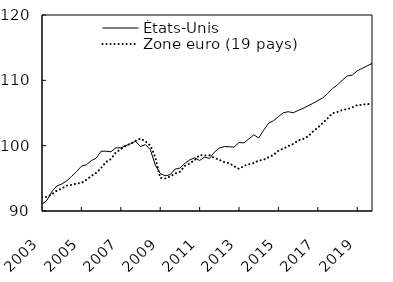
| Category | États-Unis | Zone euro (19 pays) |
|---|---|---|
| 2003-01-01 | 91.046 | 92.161 |
| 2003-04-01 | 91.627 | 92.141 |
| 2003-07-01 | 92.974 | 92.54 |
| 2003-10-01 | 93.827 | 93.105 |
| 2004-01-01 | 94.112 | 93.448 |
| 2004-04-01 | 94.613 | 93.874 |
| 2004-07-01 | 95.288 | 93.984 |
| 2004-10-01 | 96.018 | 94.198 |
| 2005-01-01 | 96.853 | 94.289 |
| 2005-04-01 | 97.074 | 94.759 |
| 2005-07-01 | 97.708 | 95.346 |
| 2005-10-01 | 98.089 | 95.832 |
| 2006-01-01 | 99.155 | 96.573 |
| 2006-04-01 | 99.152 | 97.504 |
| 2006-07-01 | 99.068 | 97.945 |
| 2006-10-01 | 99.671 | 98.972 |
| 2007-01-01 | 99.665 | 99.441 |
| 2007-04-01 | 100 | 100 |
| 2007-07-01 | 100.306 | 100.309 |
| 2007-10-01 | 100.678 | 100.751 |
| 2008-01-01 | 99.868 | 101.093 |
| 2008-04-01 | 100.158 | 100.645 |
| 2008-07-01 | 99.396 | 100.014 |
| 2008-10-01 | 97.032 | 98.231 |
| 2009-01-01 | 95.735 | 95.068 |
| 2009-04-01 | 95.396 | 94.99 |
| 2009-07-01 | 95.544 | 95.285 |
| 2009-10-01 | 96.395 | 95.72 |
| 2010-01-01 | 96.574 | 96.011 |
| 2010-04-01 | 97.284 | 96.902 |
| 2010-07-01 | 97.824 | 97.276 |
| 2010-10-01 | 98.138 | 97.812 |
| 2011-01-01 | 97.728 | 98.565 |
| 2011-04-01 | 98.254 | 98.506 |
| 2011-07-01 | 98.051 | 98.534 |
| 2011-10-01 | 99.011 | 98.118 |
| 2012-01-01 | 99.61 | 97.841 |
| 2012-04-01 | 99.867 | 97.467 |
| 2012-07-01 | 99.833 | 97.324 |
| 2012-10-01 | 99.775 | 96.865 |
| 2013-01-01 | 100.483 | 96.445 |
| 2013-04-01 | 100.431 | 96.906 |
| 2013-07-01 | 101.036 | 97.157 |
| 2013-10-01 | 101.655 | 97.332 |
| 2014-01-01 | 101.182 | 97.727 |
| 2014-04-01 | 102.368 | 97.846 |
| 2014-07-01 | 103.432 | 98.238 |
| 2014-10-01 | 103.825 | 98.582 |
| 2015-01-01 | 104.45 | 99.225 |
| 2015-04-01 | 105.037 | 99.546 |
| 2015-07-01 | 105.195 | 99.921 |
| 2015-10-01 | 105.041 | 100.27 |
| 2016-01-01 | 105.386 | 100.802 |
| 2016-04-01 | 105.706 | 101.018 |
| 2016-07-01 | 106.107 | 101.419 |
| 2016-10-01 | 106.47 | 102.151 |
| 2017-01-01 | 106.906 | 102.763 |
| 2017-04-01 | 107.313 | 103.451 |
| 2017-07-01 | 107.995 | 104.199 |
| 2017-10-01 | 108.769 | 104.956 |
| 2018-01-01 | 109.285 | 105.165 |
| 2018-04-01 | 110.061 | 105.467 |
| 2018-07-01 | 110.68 | 105.597 |
| 2018-10-01 | 110.798 | 105.86 |
| 2019-01-01 | 111.459 | 106.216 |
| 2019-04-01 | 111.826 | 106.254 |
| 2019-07-01 | 112.213 | 106.396 |
| 2019-10-01 | 112.589 | 106.288 |